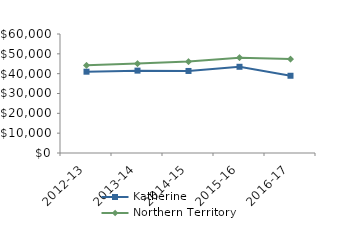
| Category | Katherine | Northern Territory |
|---|---|---|
| 2012-13 | 40989.65 | 44232.02 |
| 2013-14 | 41532 | 45075.51 |
| 2014-15 | 41366 | 46083.65 |
| 2015-16 | 43470.05 | 48046.27 |
| 2016-17 | 38944.39 | 47367.05 |